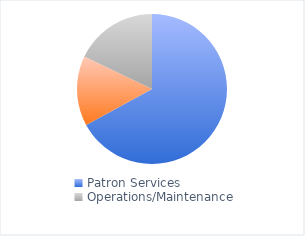
| Category | Series 0 |
|---|---|
| Patron Services | 2850064 |
| Administrative | 640159 |
| Operations/Maintenance | 759824 |